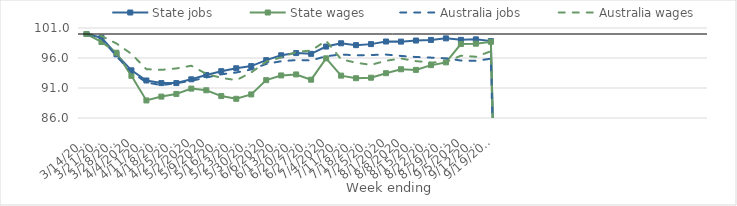
| Category | State jobs | State wages | Australia jobs | Australia wages |
|---|---|---|---|---|
| 14/03/2020 | 100 | 100 | 100 | 100 |
| 21/03/2020 | 99.374 | 98.673 | 99.278 | 99.672 |
| 28/03/2020 | 96.613 | 96.882 | 96.309 | 98.416 |
| 04/04/2020 | 93.944 | 93.025 | 93.652 | 96.688 |
| 11/04/2020 | 92.252 | 88.927 | 91.928 | 94.131 |
| 18/04/2020 | 91.817 | 89.57 | 91.47 | 94.024 |
| 25/04/2020 | 91.819 | 90.014 | 91.802 | 94.259 |
| 02/05/2020 | 92.448 | 90.898 | 92.199 | 94.709 |
| 09/05/2020 | 93.174 | 90.623 | 92.746 | 93.35 |
| 16/05/2020 | 93.803 | 89.654 | 93.278 | 92.689 |
| 23/05/2020 | 94.288 | 89.198 | 93.582 | 92.309 |
| 30/05/2020 | 94.649 | 89.931 | 94.088 | 93.584 |
| 06/06/2020 | 95.64 | 92.311 | 95.005 | 95.392 |
| 13/06/2020 | 96.454 | 93.093 | 95.464 | 96.09 |
| 20/06/2020 | 96.816 | 93.26 | 95.655 | 97.004 |
| 27/06/2020 | 96.693 | 92.385 | 95.595 | 97.247 |
| 04/07/2020 | 97.908 | 95.947 | 96.297 | 98.874 |
| 11/07/2020 | 98.452 | 93.06 | 96.584 | 95.79 |
| 18/07/2020 | 98.145 | 92.632 | 96.449 | 95.216 |
| 25/07/2020 | 98.313 | 92.717 | 96.501 | 94.86 |
| 01/08/2020 | 98.747 | 93.466 | 96.569 | 95.541 |
| 08/08/2020 | 98.729 | 94.122 | 96.344 | 95.915 |
| 15/08/2020 | 98.911 | 94.021 | 96.168 | 95.478 |
| 22/08/2020 | 99.009 | 94.809 | 96.063 | 95.259 |
| 29/08/2020 | 99.273 | 95.271 | 95.951 | 95.312 |
| 05/09/2020 | 99.022 | 98.324 | 95.576 | 96.393 |
| 12/09/2020 | 99.109 | 98.385 | 95.53 | 96.207 |
| 19/09/2020 | 98.828 | 98.703 | 95.881 | 97.123 |